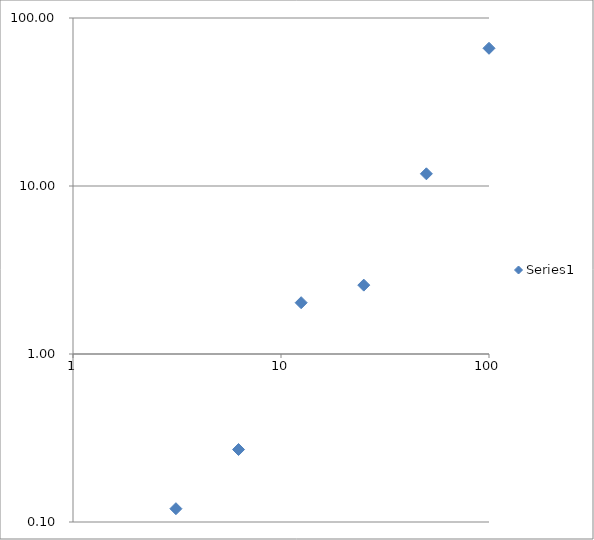
| Category | Series 0 |
|---|---|
| 100.0 | 66.02 |
| 50.0 | 11.82 |
| 25.0 | 2.57 |
| 12.5 | 2.02 |
| 6.25 | 0.27 |
| 3.125 | 0.12 |